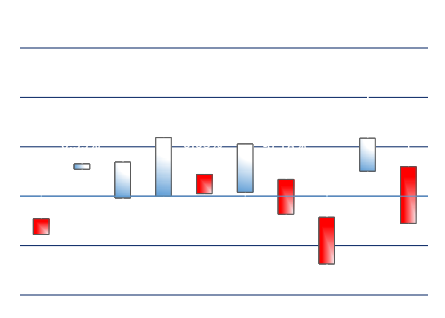
| Category | Series 0 | Series 1 | Series 2 | Series 3 |
|---|---|---|---|---|
| DXEM7 | -0.002 | 0 | -0.004 | -0.004 |
| EU6M7 | 0.003 | 0.004 | 0 | 0.003 |
| JY6M7 | 0 | 0.005 | -0.001 | 0.003 |
| BP6M7 | 0 | 0.007 | -0.004 | 0.006 |
| CA6M7 | 0.002 | 0.004 | 0 | 0 |
| SF6M7 | 0 | 0.005 | -0.001 | 0.005 |
| DA6M7 | 0.002 | 0.004 | -0.003 | -0.002 |
| NE6M7 | -0.002 | 0.002 | -0.008 | -0.007 |
| MX6M7 | 0.003 | 0.012 | 0.001 | 0.006 |
| EBM7 | 0.003 | 0.006 | -0.004 | -0.003 |